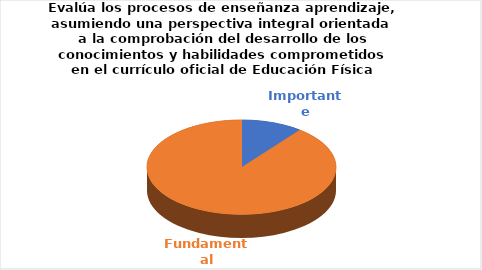
| Category | Series 0 |
|---|---|
| Importante | 2 |
| Fundamental | 17 |